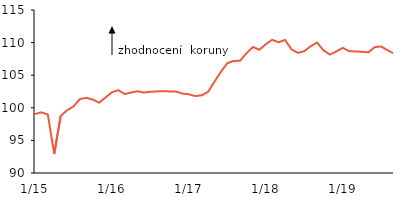
| Category | NEER |
|---|---|
|  1/15 | 99.045 |
| 2 | 99.302 |
| 3 | 98.972 |
| 4 | 92.914 |
| 5 | 98.732 |
| 6 | 99.621 |
| 7 | 100.197 |
| 8 | 101.341 |
| 9 | 101.526 |
| 10 | 101.281 |
| 11 | 100.782 |
| 12 | 101.58 |
|  1/16 | 102.385 |
| 2 | 102.704 |
| 3 | 102.101 |
| 4 | 102.341 |
| 5 | 102.539 |
| 6 | 102.329 |
| 7 | 102.459 |
| 8 | 102.511 |
| 9 | 102.56 |
| 10 | 102.512 |
| 11 | 102.492 |
| 12 | 102.18 |
|  1/17 | 102.076 |
| 2 | 101.791 |
| 3 | 101.911 |
| 4 | 102.453 |
| 5 | 103.999 |
| 6 | 105.517 |
| 7 | 106.854 |
| 8 | 107.182 |
| 9 | 107.216 |
| 10 | 108.386 |
| 11 | 109.33 |
| 12 | 108.9 |
|  1/18 | 109.753 |
| 2 | 110.424 |
| 3 | 110.052 |
| 4 | 110.413 |
| 5 | 108.968 |
| 6 | 108.426 |
| 7 | 108.684 |
| 8 | 109.438 |
| 9 | 110.02 |
| 10 | 108.812 |
| 11 | 108.171 |
| 12 | 108.626 |
|  1/19 | 109.192 |
| 2 | 108.691 |
| 3 | 108.637 |
| 4 | 108.599 |
| 5 | 108.5 |
| 6 | 109.308 |
| 7 | 109.404 |
| 8 | 108.833 |
| 9 | 108.318 |